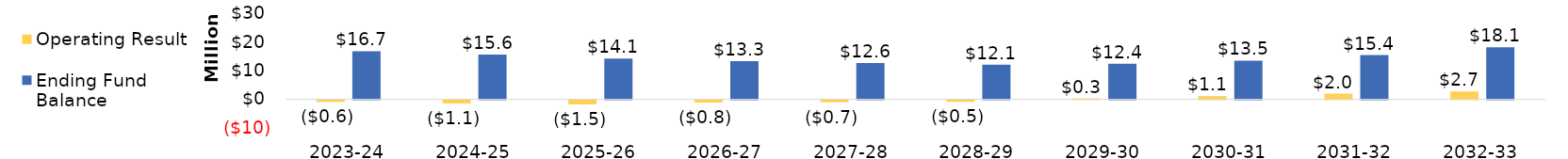
| Category | Operating Result | Ending Fund Balance |
|---|---|---|
| 2023-24 | -606612.692 | 16727208.308 |
| 2024-25 | -1121806.038 | 15605402.27 |
| 2025-26 | -1462877.627 | 14142524.643 |
| 2026-27 | -833643.116 | 13308881.527 |
| 2027-28 | -698516.821 | 12610364.706 |
| 2028-29 | -541842.29 | 12068522.417 |
| 2029-30 | 302198.362 | 12370720.778 |
| 2030-31 | 1087775.398 | 13458496.176 |
| 2031-32 | 1950640.31 | 15409136.486 |
| 2032-33 | 2718632.285 | 18127768.771 |